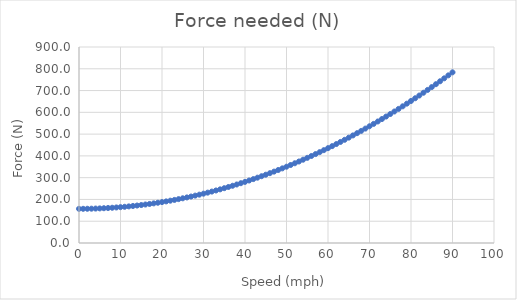
| Category | Force needed (N) |
|---|---|
| 0.0 | 156.906 |
| 1.0 | 156.984 |
| 2.0 | 157.216 |
| 3.0 | 157.603 |
| 4.0 | 158.144 |
| 5.0 | 158.841 |
| 6.0 | 159.692 |
| 7.0 | 160.698 |
| 8.0 | 161.858 |
| 9.0 | 163.174 |
| 10.0 | 164.644 |
| 11.0 | 166.269 |
| 12.0 | 168.049 |
| 13.0 | 169.983 |
| 14.0 | 172.072 |
| 15.0 | 174.316 |
| 16.0 | 176.715 |
| 17.0 | 179.268 |
| 18.0 | 181.976 |
| 19.0 | 184.839 |
| 20.0 | 187.857 |
| 21.0 | 191.029 |
| 22.0 | 194.356 |
| 23.0 | 197.838 |
| 24.0 | 201.475 |
| 25.0 | 205.266 |
| 26.0 | 209.213 |
| 27.0 | 213.313 |
| 28.0 | 217.569 |
| 29.0 | 221.98 |
| 30.0 | 226.545 |
| 31.0 | 231.265 |
| 32.0 | 236.139 |
| 33.0 | 241.169 |
| 34.0 | 246.353 |
| 35.0 | 251.692 |
| 36.0 | 257.186 |
| 37.0 | 262.834 |
| 38.0 | 268.637 |
| 39.0 | 274.595 |
| 40.0 | 280.708 |
| 41.0 | 286.975 |
| 42.0 | 293.397 |
| 43.0 | 299.974 |
| 44.0 | 306.706 |
| 45.0 | 313.593 |
| 46.0 | 320.634 |
| 47.0 | 327.83 |
| 48.0 | 335.18 |
| 49.0 | 342.686 |
| 50.0 | 350.346 |
| 51.0 | 358.161 |
| 52.0 | 366.131 |
| 53.0 | 374.255 |
| 54.0 | 382.535 |
| 55.0 | 390.968 |
| 56.0 | 399.557 |
| 57.0 | 408.301 |
| 58.0 | 417.199 |
| 59.0 | 426.252 |
| 60.0 | 435.46 |
| 61.0 | 444.822 |
| 62.0 | 454.339 |
| 63.0 | 464.011 |
| 64.0 | 473.838 |
| 65.0 | 483.82 |
| 66.0 | 493.956 |
| 67.0 | 504.247 |
| 68.0 | 514.693 |
| 69.0 | 525.293 |
| 70.0 | 536.048 |
| 71.0 | 546.958 |
| 72.0 | 558.023 |
| 73.0 | 569.243 |
| 74.0 | 580.617 |
| 75.0 | 592.146 |
| 76.0 | 603.83 |
| 77.0 | 615.668 |
| 78.0 | 627.661 |
| 79.0 | 639.809 |
| 80.0 | 652.112 |
| 81.0 | 664.57 |
| 82.0 | 677.182 |
| 83.0 | 689.949 |
| 84.0 | 702.871 |
| 85.0 | 715.947 |
| 86.0 | 729.179 |
| 87.0 | 742.565 |
| 88.0 | 756.105 |
| 89.0 | 769.801 |
| 90.0 | 783.651 |